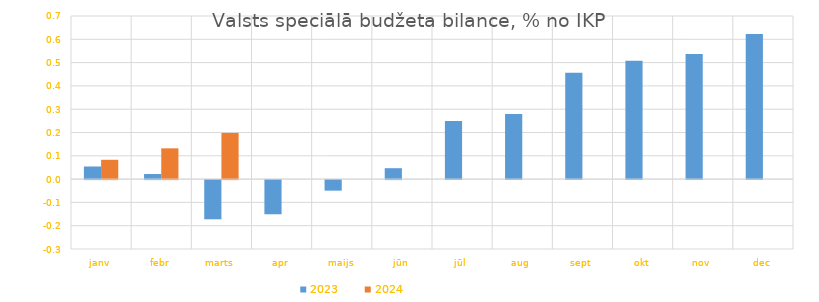
| Category | 2023 | 2024 |
|---|---|---|
| janv | 0.054 | 0.083 |
| febr | 0.022 | 0.132 |
| marts | -0.168 | 0.198 |
| apr | -0.147 | 0 |
| maijs | -0.045 | 0 |
| jūn | 0.047 | 0 |
| jūl | 0.249 | 0 |
| aug | 0.28 | 0 |
| sept | 0.456 | 0 |
| okt | 0.508 | 0 |
| nov | 0.536 | 0 |
| dec | 0.623 | 0 |